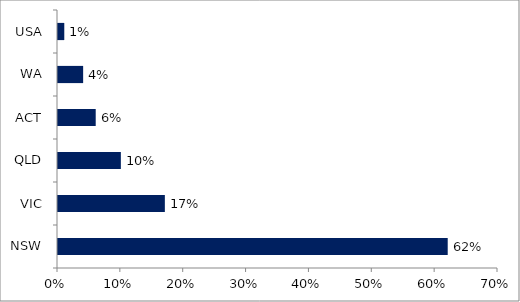
| Category | Series 0 |
|---|---|
| NSW | 0.62 |
| VIC | 0.17 |
| QLD | 0.1 |
| ACT | 0.06 |
| WA | 0.04 |
| USA | 0.01 |